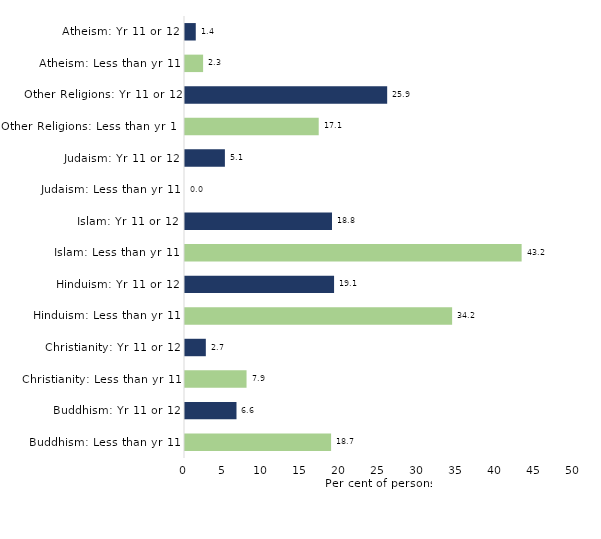
| Category | Series 0 |
|---|---|
| Buddhism: Less than yr 11 | 18.729 |
| Buddhism: Yr 11 or 12 | 6.602 |
| Christianity: Less than yr 11 | 7.89 |
| Christianity: Yr 11 or 12 | 2.67 |
| Hinduism: Less than yr 11 | 34.247 |
| Hinduism: Yr 11 or 12 | 19.112 |
| Islam: Less than yr 11 | 43.158 |
| Islam: Yr 11 or 12 | 18.846 |
| Judaism: Less than yr 11 | 0 |
| Judaism: Yr 11 or 12 | 5.115 |
| Other Religions: Less than yr 11 | 17.143 |
| Other Religions: Yr 11 or 12 | 25.92 |
| Atheism: Less than yr 11 | 2.322 |
| Atheism: Yr 11 or 12 | 1.381 |